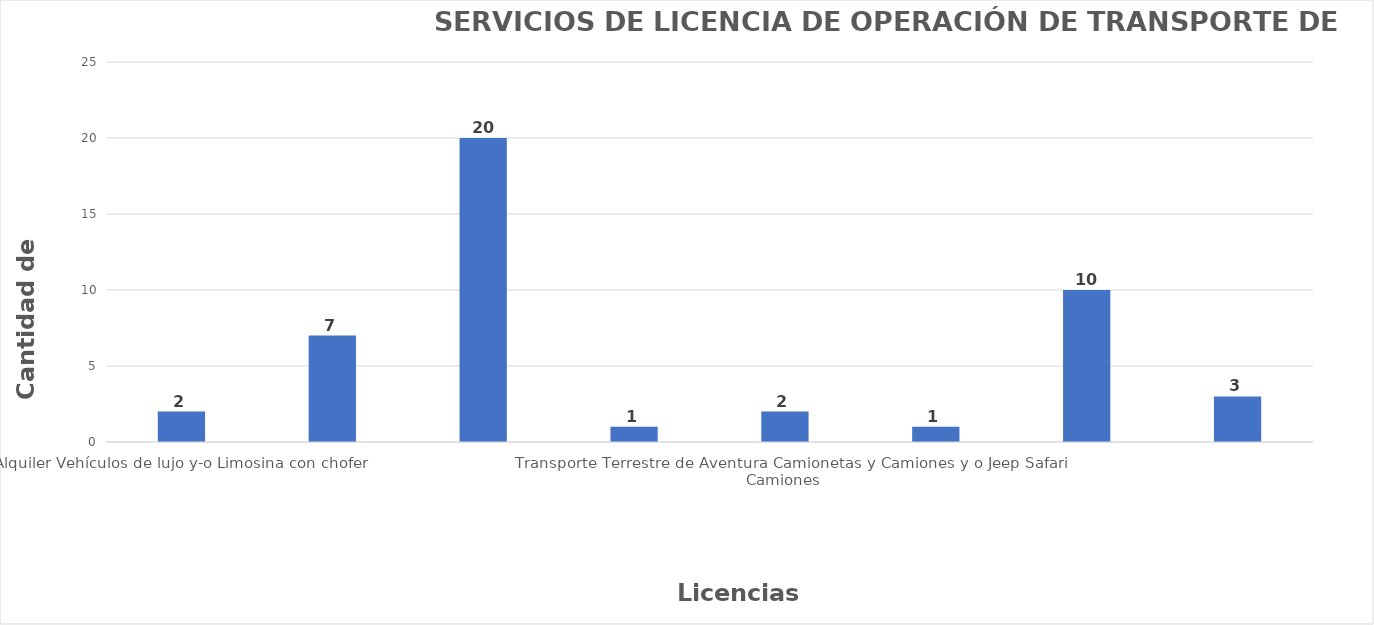
| Category | Series 0 |
|---|---|
| Alquiler Vehículos de lujo y-o Limosina con chofer  | 2 |
| Compañías Taxis Turísticos  | 7 |
| Transporte Escolar (Escuelas Centros Educativos y Universidades)  | 20 |
| Transporte City Tour (Tren sobre Ruedas) Persona Física o Moral  | 1 |
| Transporte Terrestre de Aventura Camionetas y Camiones y o Jeep Safari Camiones  | 2 |
| Transporte de Personal u-o Empresarial  | 1 |
| Transporte Turístico Terrestres de Autobuses y Minibuses Persona Física o Moral  | 10 |
| Persona Moral, Transporte Turístico Terrestre de Aventura (Four Wheel y Buggy)  | 3 |